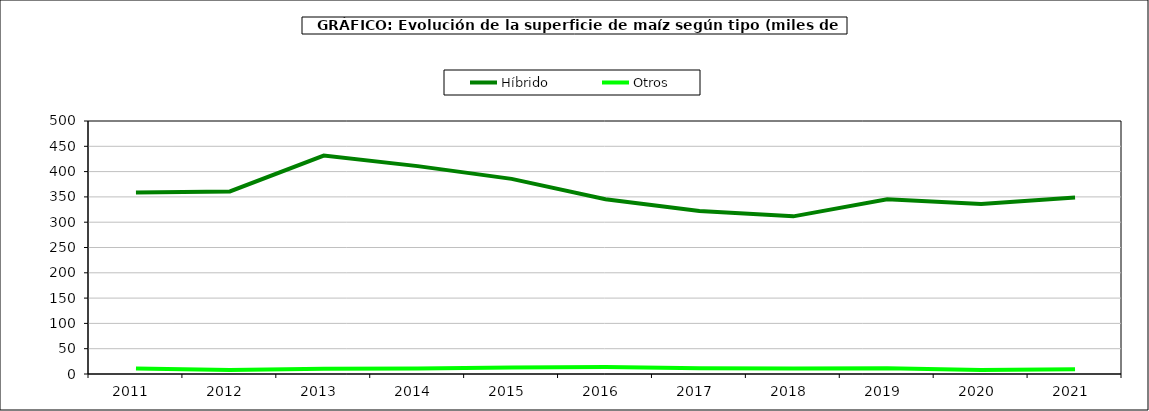
| Category | Híbrido | Otros |
|---|---|---|
| 2011.0 | 358.45 | 10.814 |
| 2012.0 | 360.837 | 7.917 |
| 2013.0 | 431.742 | 10.556 |
| 2014.0 | 410.83 | 10.775 |
| 2015.0 | 385.617 | 12.64 |
| 2016.0 | 345.266 | 14.009 |
| 2017.0 | 322.341 | 11.287 |
| 2018.0 | 311.54 | 10.833 |
| 2019.0 | 345.448 | 11.377 |
| 2020.0 | 336.099 | 7.679 |
| 2021.0 | 348.694 | 9.575 |